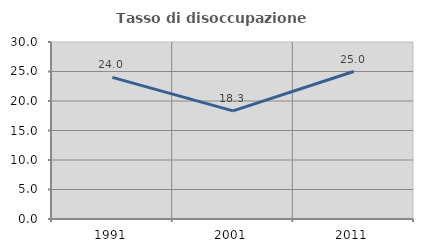
| Category | Tasso di disoccupazione giovanile  |
|---|---|
| 1991.0 | 24 |
| 2001.0 | 18.333 |
| 2011.0 | 25 |